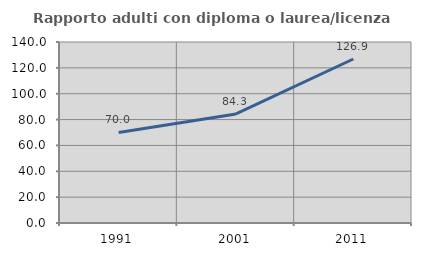
| Category | Rapporto adulti con diploma o laurea/licenza media  |
|---|---|
| 1991.0 | 70.042 |
| 2001.0 | 84.332 |
| 2011.0 | 126.861 |